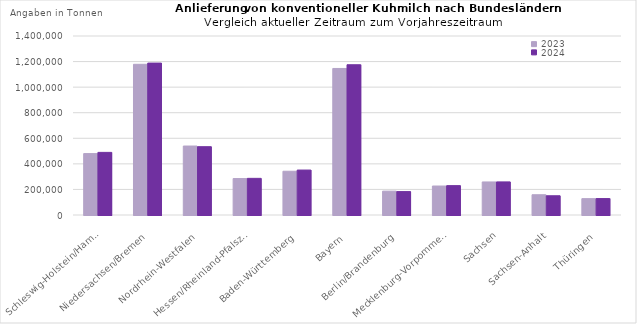
| Category | 2023 | 2024 |
|---|---|---|
| Schleswig-Holstein/Hamburg | 480384.273 | 489694.47 |
| Niedersachsen/Bremen | 1178744.008 | 1188211.312 |
| Nordrhein-Westfalen | 539306.991 | 534310.934 |
| Hessen/Rheinland-PfalszSaarland | 285054.633 | 286612.972 |
| Baden-Württemberg | 342253.02 | 351557.911 |
| Bayern | 1146128.825 | 1175149.12 |
| Berlin/Brandenburg | 186532.568 | 183092.962 |
| Mecklenburg-Vorpommern | 226575.972 | 229666.106 |
| Sachsen | 258466.369 | 258722.112 |
| Sachsen-Anhalt | 158457.426 | 150498.446 |
| Thüringen | 127898.8 | 128558.819 |